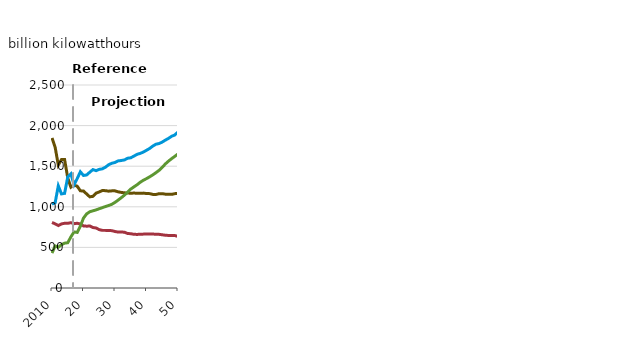
| Category | Coal | Gas & oil | Nuclear | Renewables |
|---|---|---|---|---|
| 2010.0 | 1847.4 | 1031.92 | 806.969 | 430.021 |
| 2011.0 | 1733.5 | 1050.48 | 790.204 | 518.029 |
| 2012.0 | 1514.2 | 1258.196 | 769.332 | 501.96 |
| 2013.0 | 1581.25 | 1158.956 | 789.016 | 532.586 |
| 2014.0 | 1581.71 | 1165.557 | 797.166 | 552.294 |
| 2015.0 | 1354.396 | 1366.797 | 797.178 | 557.597 |
| 2016.0 | 1241.706 | 1406.659 | 804.239 | 629.676 |
| 2017.0 | 1268.25 | 1270.59 | 792.318 | 690.786 |
| 2018.0 | 1253.724 | 1347.249 | 797.014 | 684.509 |
| 2019.0 | 1197.143 | 1431.14 | 788.091 | 760.126 |
| 20.0 | 1194.012 | 1385.395 | 764.657 | 861.137 |
| 2021.0 | 1158.112 | 1392.311 | 761.198 | 912.412 |
| 2022.0 | 1122.616 | 1426.358 | 763.492 | 939.397 |
| 2023.0 | 1128.708 | 1458.174 | 745.053 | 950.636 |
| 2024.0 | 1168.256 | 1445.372 | 738.864 | 961.881 |
| 2025.0 | 1183.211 | 1461.187 | 718.577 | 976.361 |
| 2026.0 | 1200.558 | 1467.749 | 709.668 | 989.9 |
| 2027.0 | 1198.622 | 1488.627 | 709.656 | 1003.156 |
| 2028.0 | 1192.4 | 1518.807 | 708.669 | 1015.848 |
| 2029.0 | 1196.428 | 1536.094 | 706.122 | 1030.998 |
| 30.0 | 1196.122 | 1546 | 695.889 | 1054.723 |
| 2031.0 | 1184.568 | 1565.049 | 688.672 | 1082.452 |
| 2032.0 | 1177.001 | 1570.286 | 689.552 | 1111.731 |
| 2033.0 | 1172.362 | 1577.272 | 686.973 | 1144.115 |
| 2034.0 | 1169.629 | 1597.897 | 671.148 | 1179.299 |
| 2035.0 | 1166.952 | 1603.636 | 668.584 | 1218.74 |
| 2036.0 | 1169.307 | 1624.07 | 661.017 | 1245.071 |
| 2037.0 | 1166.786 | 1645.942 | 660.053 | 1271.279 |
| 2038.0 | 1167.371 | 1657.801 | 661.287 | 1301.92 |
| 2039.0 | 1168.505 | 1673.866 | 663.46 | 1326.849 |
| 40.0 | 1163.587 | 1696.257 | 665.719 | 1347.011 |
| 2041.0 | 1162.105 | 1718.501 | 665.788 | 1368.868 |
| 2042.0 | 1152.887 | 1747.947 | 664.109 | 1393.291 |
| 2043.0 | 1151.536 | 1770.779 | 662.431 | 1420.22 |
| 2044.0 | 1161.826 | 1779.055 | 661.057 | 1449.474 |
| 2045.0 | 1161.929 | 1797.307 | 655.429 | 1486.055 |
| 2046.0 | 1155.274 | 1821.476 | 649.927 | 1528.318 |
| 2047.0 | 1154.751 | 1842.744 | 647.093 | 1562.922 |
| 2048.0 | 1153.096 | 1869.237 | 645.884 | 1593.321 |
| 2049.0 | 1162.055 | 1884.427 | 645.884 | 1622.064 |
| 50.0 | 1164.638 | 1922.292 | 634.918 | 1650.746 |